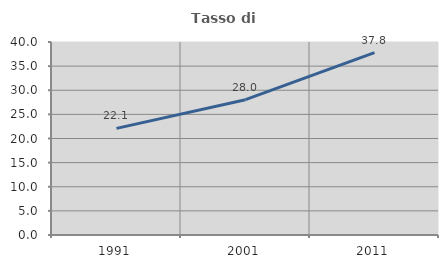
| Category | Tasso di occupazione   |
|---|---|
| 1991.0 | 22.093 |
| 2001.0 | 28.041 |
| 2011.0 | 37.785 |